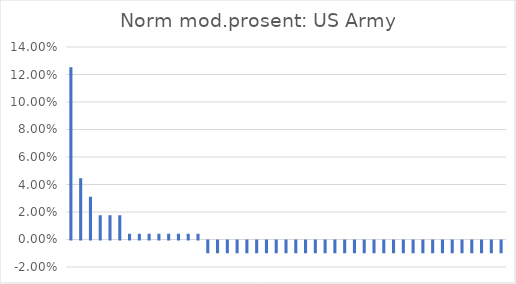
| Category | Series 0 |
|---|---|
| STRYKER | 0.125 |
| Black Hawk | 0.045 |
| Bradley | 0.031 |
| Gulfstream | 0.018 |
| Abrams | 0.018 |
| M113 | 0.018 |
| Maxx Pro Dash | 0.004 |
| TOWED | 0.004 |
| RC-12X Guardrail | 0.004 |
| EO-5C ARL | 0.004 |
| M88 (M60 Patton) | 0.004 |
| AH-64 | 0.004 |
| HMMWV | 0.004 |
| M109 | 0.004 |
| Husky MK3 | -0.009 |
| M270 MLRS | -0.009 |
| CH-47 | -0.009 |
| LAV-25 | -0.009 |
| M9 | -0.009 |
| LCM 8 | -0.009 |
| NASAMS | -0.009 |
| LCU-2000 | -0.009 |
| UH-72 | -0.009 |
| Oshkosh M-ATV | -0.009 |
| Cessna 560 | -0.009 |
| Frank Besson | -0.009 |
| M983 HEMTT | -0.009 |
| RQ-7B Shadow | -0.009 |
| MQ-1C Gray Eagle | -0.009 |
| BAE SYSTEMS | -0.009 |
| Hydrema 910 | -0.009 |
| TH-67 | -0.009 |
| REBS | -0.009 |
| M110 | -0.009 |
| SA-227 | -0.009 |
| M1120 HEMTT | -0.009 |
| T-6D Texanll | -0.009 |
| Wolverine HAB | -0.009 |
| TO-5C | -0.009 |
| Aardvark | -0.009 |
| UH-1H/V | -0.009 |
| M117 Base | -0.009 |
| C-12 Huron | -0.009 |
| M142 HIMARS | -0.009 |
| M117 | -0.009 |